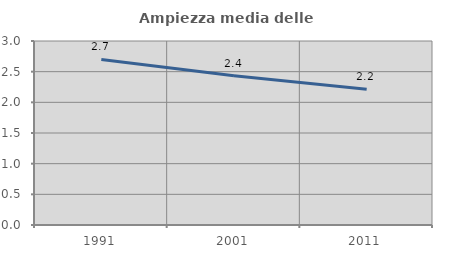
| Category | Ampiezza media delle famiglie |
|---|---|
| 1991.0 | 2.7 |
| 2001.0 | 2.435 |
| 2011.0 | 2.214 |